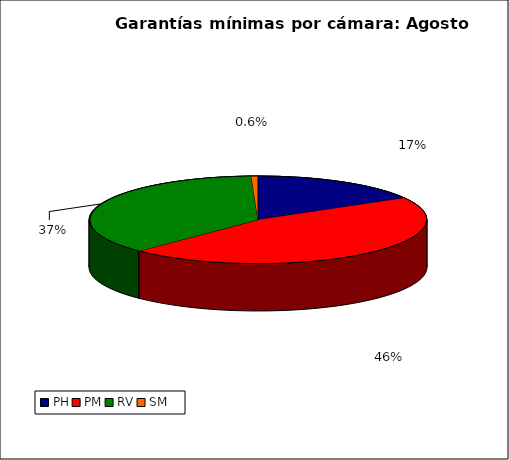
| Category | Series 0 |
|---|---|
| PH | 1994.129 |
| PM | 5451.296 |
| RV | 4404.019 |
| SM | 76.021 |